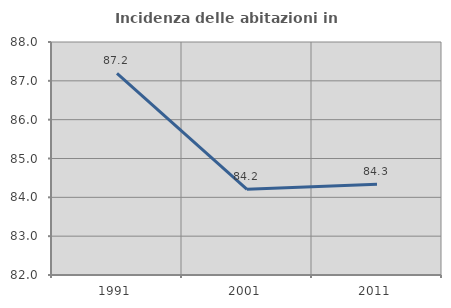
| Category | Incidenza delle abitazioni in proprietà  |
|---|---|
| 1991.0 | 87.193 |
| 2001.0 | 84.206 |
| 2011.0 | 84.336 |